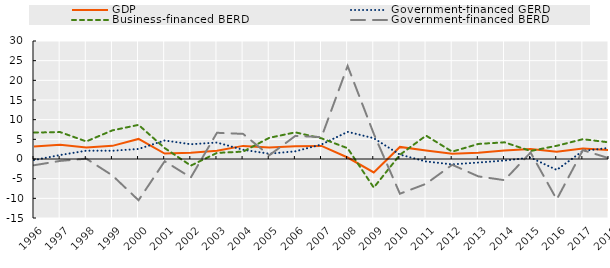
| Category | GDP | Government-financed GERD | Business-financed BERD | Government-financed BERD |
|---|---|---|---|---|
| 1996.0 | 3.207 | -0.273 | 6.72 | -1.589 |
| 1997.0 | 3.632 | 1.005 | 6.842 | -0.491 |
| 1998.0 | 2.954 | 2.113 | 4.467 | 0.085 |
| 1999.0 | 3.342 | 2.097 | 7.281 | -4.185 |
| 2000.0 | 5.107 | 2.55 | 8.674 | -10.491 |
| 2001.0 | 1.395 | 4.706 | 2.776 | -0.567 |
| 2002.0 | 1.611 | 3.751 | -1.687 | -4.699 |
| 2003.0 | 2.102 | 4.188 | 1.551 | 6.667 |
| 2004.0 | 3.334 | 2.337 | 1.877 | 6.386 |
| 2005.0 | 2.928 | 1.35 | 5.383 | 0.935 |
| 2006.0 | 3.267 | 1.953 | 6.776 | 5.879 |
| 2007.0 | 3.332 | 3.694 | 5.25 | 5.569 |
| 2008.0 | 0.378 | 6.901 | 2.739 | 23.654 |
| 2009.0 | -3.425 | 5.285 | -7.271 | 6.409 |
| 2010.0 | 3.069 | 1.114 | 1.069 | -8.828 |
| 2011.0 | 2.141 | -0.628 | 5.942 | -6.308 |
| 2012.0 | 1.349 | -1.366 | 1.869 | -1.47 |
| 2013.0 | 1.611 | -0.901 | 3.825 | -4.416 |
| 2014.0 | 2.186 | -0.395 | 4.242 | -5.38 |
| 2015.0 | 2.567 | 0.356 | 2.037 | 1.648 |
| 2016.0 | 1.825 | -2.776 | 3.361 | -10.286 |
| 2017.0 | 2.689 | 2.06 | 5.036 | 2.249 |
| 2018.0 | 2.304 | 2.828 | 4.23 | 0.191 |